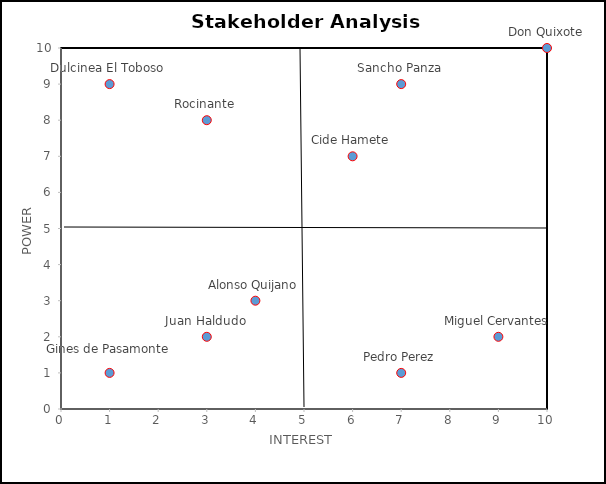
| Category | STAKEHOLDER NAME |
|---|---|
| 10.0 | 10 |
| 7.0 | 9 |
| 6.0 | 7 |
| 1.0 | 9 |
| 1.0 | 1 |
| 3.0 | 2 |
| 3.0 | 8 |
| 7.0 | 1 |
| 4.0 | 3 |
| 9.0 | 2 |